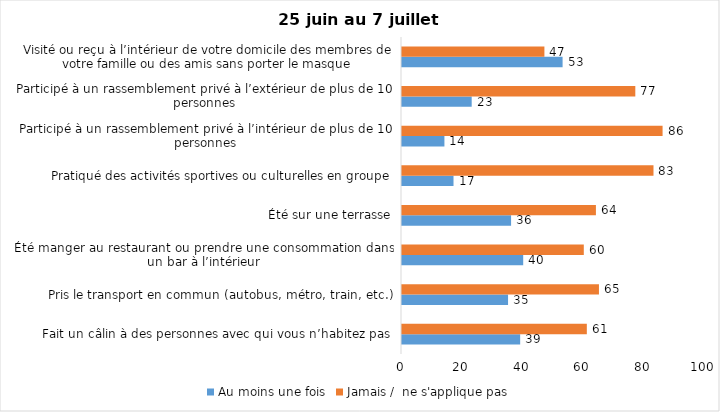
| Category | Au moins une fois | Jamais /  ne s'applique pas |
|---|---|---|
| Fait un câlin à des personnes avec qui vous n’habitez pas | 39 | 61 |
| Pris le transport en commun (autobus, métro, train, etc.) | 35 | 65 |
| Été manger au restaurant ou prendre une consommation dans un bar à l’intérieur | 40 | 60 |
| Été sur une terrasse | 36 | 64 |
| Pratiqué des activités sportives ou culturelles en groupe | 17 | 83 |
| Participé à un rassemblement privé à l’intérieur de plus de 10 personnes | 14 | 86 |
| Participé à un rassemblement privé à l’extérieur de plus de 10 personnes | 23 | 77 |
| Visité ou reçu à l’intérieur de votre domicile des membres de votre famille ou des amis sans porter le masque | 53 | 47 |